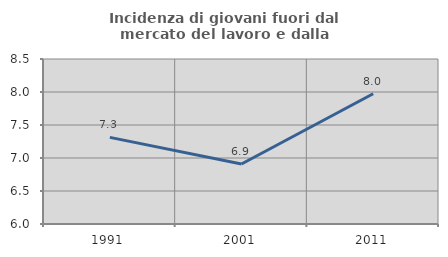
| Category | Incidenza di giovani fuori dal mercato del lavoro e dalla formazione  |
|---|---|
| 1991.0 | 7.312 |
| 2001.0 | 6.909 |
| 2011.0 | 7.974 |